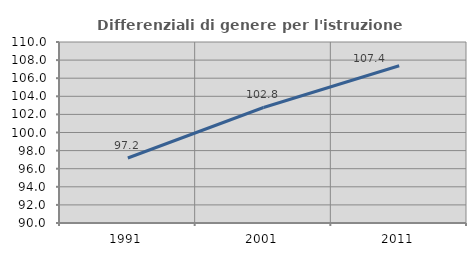
| Category | Differenziali di genere per l'istruzione superiore |
|---|---|
| 1991.0 | 97.182 |
| 2001.0 | 102.764 |
| 2011.0 | 107.38 |